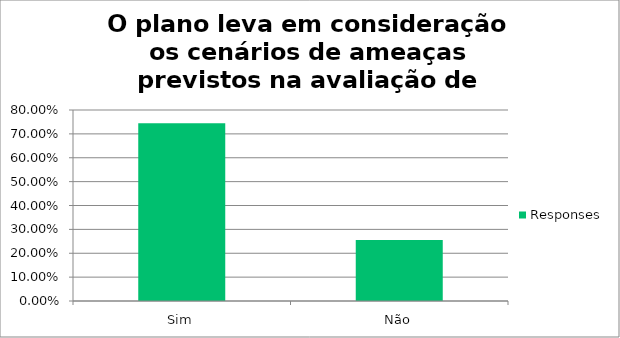
| Category | Responses |
|---|---|
| Sim | 0.744 |
| Não | 0.256 |